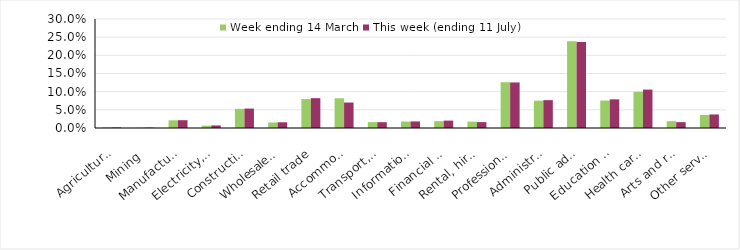
| Category | Week ending 14 March | This week (ending 11 July) |
|---|---|---|
| Agriculture, forestry and fishing | 0.002 | 0.002 |
| Mining | 0.001 | 0.001 |
| Manufacturing | 0.021 | 0.021 |
| Electricity, gas, water and waste services | 0.006 | 0.007 |
| Construction | 0.053 | 0.053 |
| Wholesale trade | 0.015 | 0.016 |
| Retail trade | 0.08 | 0.082 |
| Accommodation and food services | 0.082 | 0.07 |
| Transport, postal and warehousing | 0.016 | 0.016 |
| Information media and telecommunications | 0.018 | 0.018 |
| Financial and insurance services | 0.019 | 0.02 |
| Rental, hiring and real estate services | 0.017 | 0.016 |
| Professional, scientific and technical services | 0.126 | 0.125 |
| Administrative and support services | 0.075 | 0.077 |
| Public administration and safety | 0.239 | 0.237 |
| Education and training | 0.076 | 0.079 |
| Health care and social assistance | 0.1 | 0.106 |
| Arts and recreation services | 0.019 | 0.016 |
| Other services | 0.036 | 0.037 |